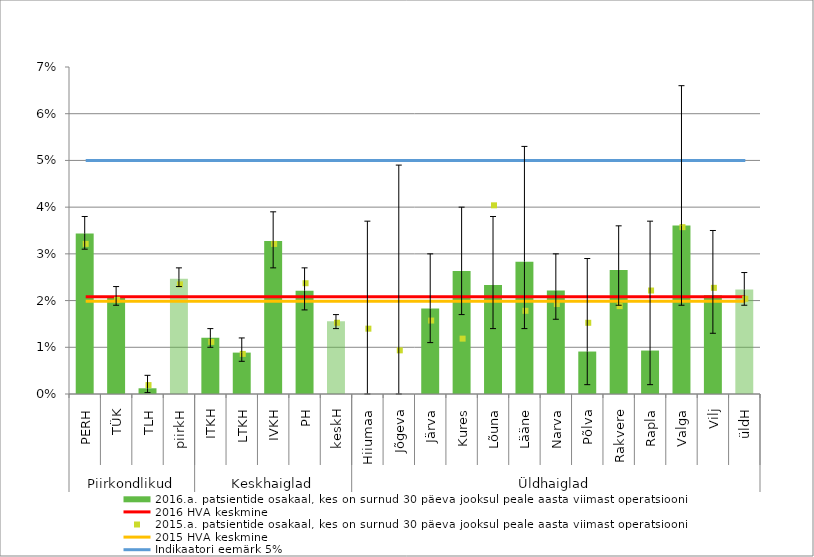
| Category | 2016.a. patsientide osakaal, kes on surnud 30 päeva jooksul peale aasta viimast operatsiooni |
|---|---|
| 0 | 0.034 |
| 1 | 0.021 |
| 2 | 0.001 |
| 3 | 0.025 |
| 4 | 0.012 |
| 5 | 0.009 |
| 6 | 0.033 |
| 7 | 0.022 |
| 8 | 0.016 |
| 9 | 0 |
| 10 | 0 |
| 11 | 0.018 |
| 12 | 0.026 |
| 13 | 0.023 |
| 14 | 0.028 |
| 15 | 0.022 |
| 16 | 0.009 |
| 17 | 0.027 |
| 18 | 0.009 |
| 19 | 0.036 |
| 20 | 0.021 |
| 21 | 0.022 |